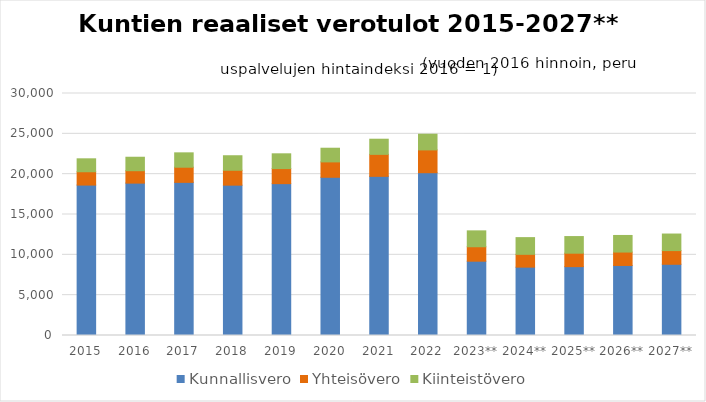
| Category | Kunnallisvero | Yhteisövero | Kiinteistövero |
|---|---|---|---|
| 2015 | 18646.898 | 1652.438 | 1604.013 |
| 2016 | 18890.563 | 1537.872 | 1669.703 |
| 2017 | 18984.903 | 1876.821 | 1781.79 |
| 2018 | 18637.434 | 1845.137 | 1801.77 |
| 2019 | 18825.284 | 1868.046 | 1830.346 |
| 2020 | 19613.622 | 1907.626 | 1694.608 |
| 2021 | 19729.802 | 2724.595 | 1879.564 |
| 2022 | 20180.604 | 2827.179 | 1944.423 |
| 2023** | 9211.525 | 1790.384 | 1969.422 |
| 2024** | 8474.566 | 1587.328 | 2072.344 |
| 2025** | 8536.409 | 1665.851 | 2062.894 |
| 2026** | 8683.004 | 1660.73 | 2056.945 |
| 2027** | 8828.506 | 1698.107 | 2052.566 |